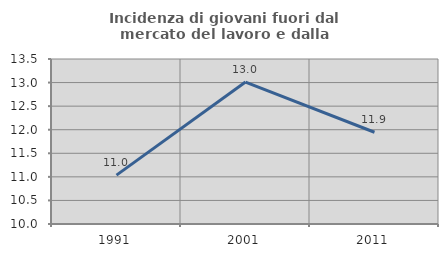
| Category | Incidenza di giovani fuori dal mercato del lavoro e dalla formazione  |
|---|---|
| 1991.0 | 11.037 |
| 2001.0 | 13.011 |
| 2011.0 | 11.946 |